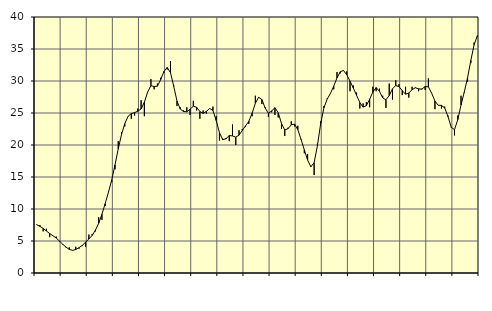
| Category | Piggar | Series 1 |
|---|---|---|
| nan | 7.6 | 7.55 |
| 87.0 | 7.5 | 7.29 |
| 87.0 | 6.5 | 6.97 |
| 87.0 | 6.9 | 6.56 |
| nan | 5.6 | 6.17 |
| 88.0 | 5.8 | 5.82 |
| 88.0 | 5.7 | 5.46 |
| 88.0 | 4.9 | 4.99 |
| nan | 4.4 | 4.48 |
| 89.0 | 4 | 4.05 |
| 89.0 | 4 | 3.69 |
| 89.0 | 3.5 | 3.54 |
| nan | 4.1 | 3.67 |
| 90.0 | 3.8 | 3.96 |
| 90.0 | 4.2 | 4.33 |
| 90.0 | 4.1 | 4.82 |
| nan | 6 | 5.31 |
| 91.0 | 6.1 | 5.87 |
| 91.0 | 6.5 | 6.68 |
| 91.0 | 8.7 | 7.75 |
| nan | 8.3 | 9.17 |
| 92.0 | 10.5 | 10.85 |
| 92.0 | 12.7 | 12.63 |
| 92.0 | 14.2 | 14.54 |
| nan | 16.2 | 16.88 |
| 93.0 | 20.6 | 19.41 |
| 93.0 | 22 | 21.63 |
| 93.0 | 22.9 | 23.33 |
| nan | 24.5 | 24.47 |
| 94.0 | 24.1 | 24.91 |
| 94.0 | 24.6 | 25.06 |
| 94.0 | 25.7 | 25.28 |
| nan | 27 | 25.64 |
| 95.0 | 24.5 | 26.69 |
| 95.0 | 28.2 | 28.27 |
| 95.0 | 30.3 | 29.26 |
| nan | 28.7 | 29.14 |
| 96.0 | 29.6 | 29.19 |
| 96.0 | 30.5 | 30.22 |
| 96.0 | 31.3 | 31.48 |
| nan | 31.8 | 32.11 |
| 97.0 | 33.1 | 31.3 |
| 97.0 | 29.3 | 29.16 |
| 97.0 | 26.1 | 26.86 |
| nan | 25.9 | 25.61 |
| 98.0 | 25.4 | 25.23 |
| 98.0 | 25.9 | 25.19 |
| 98.0 | 24.7 | 25.59 |
| nan | 26.9 | 26.06 |
| 99.0 | 25.4 | 25.9 |
| 99.0 | 24.1 | 25.23 |
| 99.0 | 25.4 | 24.93 |
| nan | 24.9 | 25.25 |
| 0.0 | 25.7 | 25.71 |
| 0.0 | 26 | 25.4 |
| 0.0 | 24.5 | 23.83 |
| nan | 20.7 | 21.93 |
| 1.0 | 21 | 20.83 |
| 1.0 | 21.1 | 20.98 |
| 1.0 | 20.6 | 21.48 |
| nan | 23.2 | 21.42 |
| 2.0 | 20 | 21.23 |
| 2.0 | 22.3 | 21.54 |
| 2.0 | 22.5 | 22.28 |
| nan | 22.8 | 23 |
| 3.0 | 23.3 | 23.71 |
| 3.0 | 24.5 | 24.96 |
| 3.0 | 27.7 | 26.53 |
| nan | 27.5 | 27.45 |
| 4.0 | 26.4 | 27.1 |
| 4.0 | 25.9 | 25.78 |
| 4.0 | 24.4 | 24.94 |
| nan | 25.1 | 25.34 |
| 5.0 | 24.7 | 25.82 |
| 5.0 | 24.3 | 25.04 |
| 5.0 | 22.5 | 23.37 |
| nan | 21.4 | 22.35 |
| 6.0 | 22.7 | 22.55 |
| 6.0 | 23.7 | 23.16 |
| 6.0 | 22.9 | 23.27 |
| nan | 23 | 22.4 |
| 7.0 | 20.8 | 20.88 |
| 7.0 | 18.7 | 19.24 |
| 7.0 | 18.6 | 17.64 |
| nan | 16.7 | 16.61 |
| 8.0 | 15.3 | 17.23 |
| 8.0 | 20.2 | 19.89 |
| 8.0 | 23.7 | 23.33 |
| nan | 26.1 | 25.82 |
| 9.0 | 27.3 | 27.18 |
| 9.0 | 28.1 | 28.06 |
| 9.0 | 28.7 | 29.19 |
| nan | 31.4 | 30.48 |
| 10.0 | 31.2 | 31.45 |
| 10.0 | 31.6 | 31.64 |
| 10.0 | 31.5 | 30.96 |
| nan | 28.4 | 29.98 |
| 11.0 | 29.3 | 28.91 |
| 11.0 | 28.2 | 27.76 |
| 11.0 | 25.7 | 26.63 |
| nan | 26.5 | 25.92 |
| 12.0 | 26.7 | 26.15 |
| 12.0 | 25.9 | 27.13 |
| 12.0 | 29.1 | 28.3 |
| nan | 28.4 | 28.97 |
| 13.0 | 28.8 | 28.4 |
| 13.0 | 27.7 | 27.37 |
| 13.0 | 25.8 | 27.06 |
| nan | 29.6 | 27.72 |
| 14.0 | 27.1 | 28.78 |
| 14.0 | 30.1 | 29.29 |
| 14.0 | 29.5 | 29.12 |
| nan | 27.8 | 28.49 |
| 15.0 | 29.1 | 27.94 |
| 15.0 | 27.4 | 28.12 |
| 15.0 | 29.1 | 28.64 |
| nan | 29 | 28.95 |
| 16.0 | 28.4 | 28.78 |
| 16.0 | 28.8 | 28.72 |
| 16.0 | 28.6 | 29.15 |
| nan | 30.4 | 29.08 |
| 17.0 | 28.1 | 28.1 |
| 17.0 | 25.6 | 26.87 |
| 17.0 | 26.2 | 26.21 |
| nan | 25.7 | 26.19 |
| 18.0 | 26 | 25.78 |
| 18.0 | 24.6 | 24.44 |
| 18.0 | 22.7 | 22.78 |
| nan | 21.5 | 22.39 |
| 19.0 | 24.6 | 23.96 |
| 19.0 | 27.7 | 26.26 |
| 19.0 | 28.2 | 28.29 |
| nan | 29.9 | 30.51 |
| 20.0 | 32.8 | 33.21 |
| 20.0 | 36 | 35.66 |
| 20.0 | 36.9 | 37.08 |